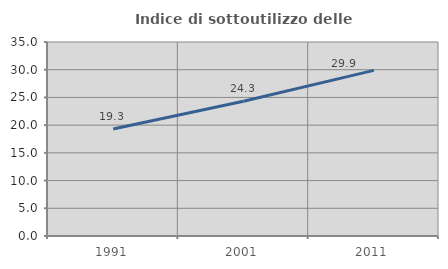
| Category | Indice di sottoutilizzo delle abitazioni  |
|---|---|
| 1991.0 | 19.301 |
| 2001.0 | 24.315 |
| 2011.0 | 29.874 |